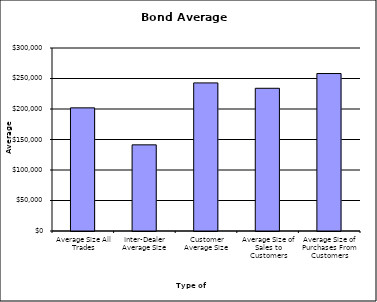
| Category | Security Type |
|---|---|
| Average Size All Trades | 201847.593 |
| Inter-Dealer Average Size | 141230.881 |
| Customer Average Size | 242766.122 |
| Average Size of Sales to Customers | 233941.634 |
| Average Size of Purchases From Customers | 258170.462 |